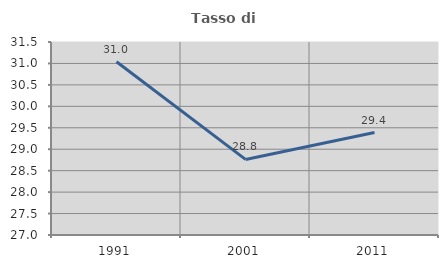
| Category | Tasso di occupazione   |
|---|---|
| 1991.0 | 31.039 |
| 2001.0 | 28.763 |
| 2011.0 | 29.389 |